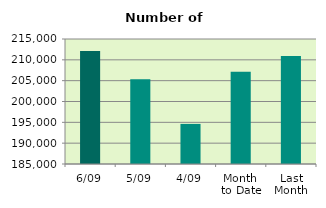
| Category | Series 0 |
|---|---|
| 6/09 | 212092 |
| 5/09 | 205360 |
| 4/09 | 194624 |
| Month 
to Date | 207168.5 |
| Last
Month | 210930.348 |